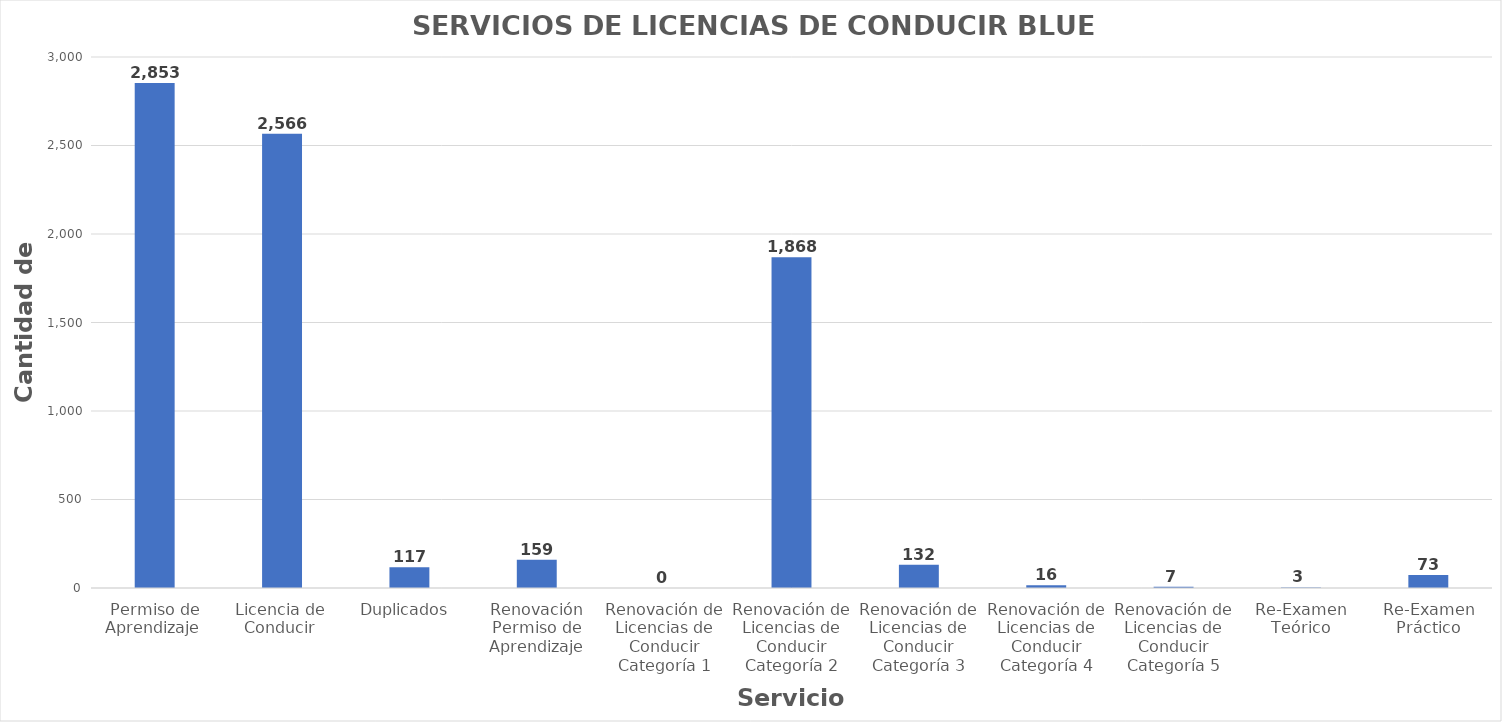
| Category | Series 0 |
|---|---|
| Permiso de Aprendizaje  | 2853 |
| Licencia de  Conducir  | 2566 |
| Duplicados  | 117 |
| Renovación Permiso de Aprendizaje | 159 |
| Renovación de Licencias de Conducir Categoría 1 | 0 |
| Renovación de Licencias de Conducir Categoría 2 | 1868 |
| Renovación de Licencias de Conducir Categoría 3 | 132 |
| Renovación de Licencias de Conducir Categoría 4 | 16 |
| Renovación de Licencias de Conducir Categoría 5 | 7 |
| Re-Examen Teórico | 3 |
| Re-Examen Práctico | 73 |